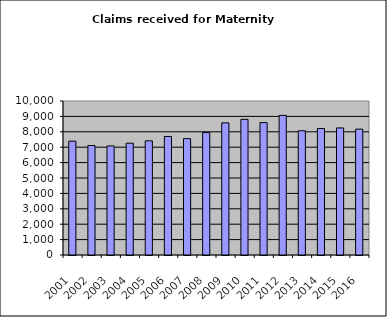
| Category | Series 1 |
|---|---|
| 2001.0 | 7392 |
| 2002.0 | 7111 |
| 2003.0 | 7083 |
| 2004.0 | 7258 |
| 2005.0 | 7413 |
| 2006.0 | 7697 |
| 2007.0 | 7554 |
| 2008.0 | 7952 |
| 2009.0 | 8579 |
| 2010.0 | 8808 |
| 2011.0 | 8595 |
| 2012.0 | 9067 |
| 2013.0 | 8067 |
| 2014.0 | 8216 |
| 2015.0 | 8250 |
| 2016.0 | 8173 |